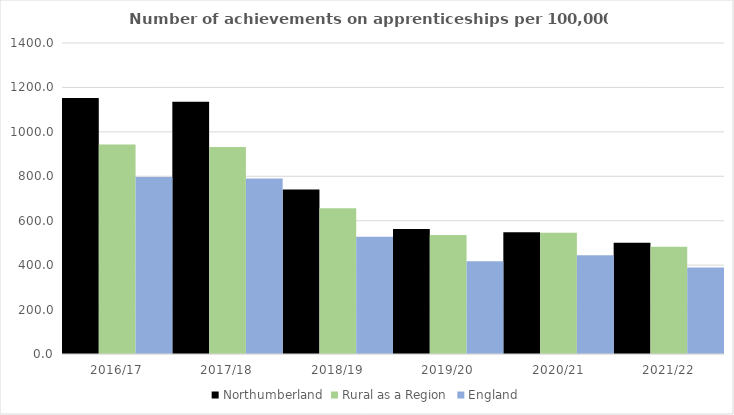
| Category | Northumberland | Rural as a Region | England |
|---|---|---|---|
| 2016/17 | 1152 | 942.594 | 797 |
| 2017/18 | 1136 | 931.709 | 790 |
| 2018/19 | 740 | 656.44 | 528 |
| 2019/20 | 563 | 535.552 | 418 |
| 2020/21 | 548 | 545.333 | 444 |
| 2021/22 | 501 | 482.936 | 389 |